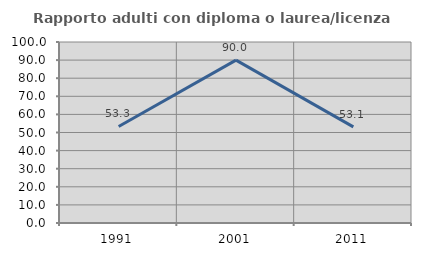
| Category | Rapporto adulti con diploma o laurea/licenza media  |
|---|---|
| 1991.0 | 53.333 |
| 2001.0 | 90 |
| 2011.0 | 53.125 |